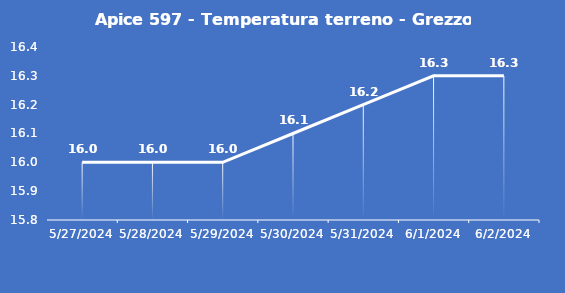
| Category | Apice 597 - Temperatura terreno - Grezzo (°C) |
|---|---|
| 5/27/24 | 16 |
| 5/28/24 | 16 |
| 5/29/24 | 16 |
| 5/30/24 | 16.1 |
| 5/31/24 | 16.2 |
| 6/1/24 | 16.3 |
| 6/2/24 | 16.3 |